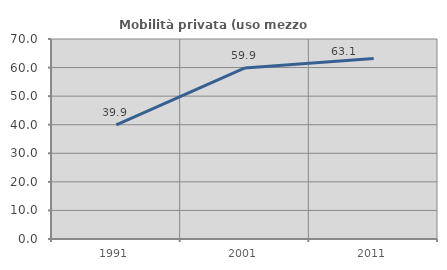
| Category | Mobilità privata (uso mezzo privato) |
|---|---|
| 1991.0 | 39.907 |
| 2001.0 | 59.856 |
| 2011.0 | 63.146 |